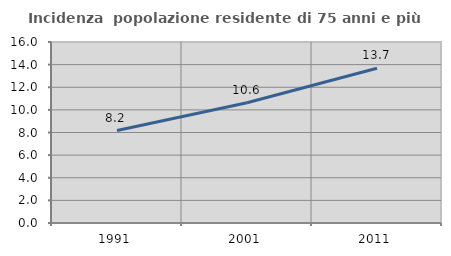
| Category | Incidenza  popolazione residente di 75 anni e più |
|---|---|
| 1991.0 | 8.172 |
| 2001.0 | 10.632 |
| 2011.0 | 13.674 |